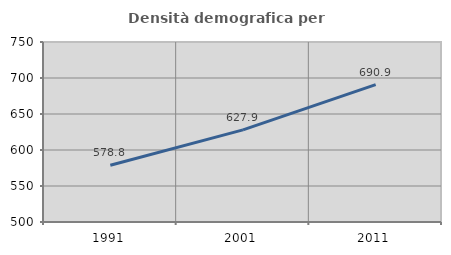
| Category | Densità demografica |
|---|---|
| 1991.0 | 578.758 |
| 2001.0 | 627.893 |
| 2011.0 | 690.9 |